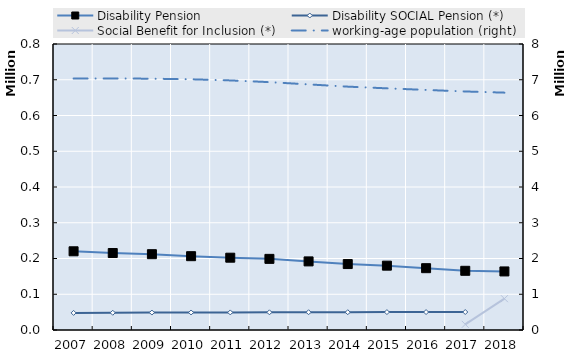
| Category | Disability Pension | Disability SOCIAL Pension (*) | Social Benefit for Inclusion (*) |
|---|---|---|---|
| 2007.0 | 220161 | 47835 | 0 |
| 2008.0 | 215330 | 48206 | 0 |
| 2009.0 | 212079 | 48808 | 0 |
| 2010.0 | 206496 | 48992 | 0 |
| 2011.0 | 202257 | 49127 | 0 |
| 2012.0 | 198970 | 49470 | 0 |
| 2013.0 | 191883 | 49734 | 0 |
| 2014.0 | 184441 | 49775 | 0 |
| 2015.0 | 179941 | 50051 | 0 |
| 2016.0 | 172920 | 50156 | 0 |
| 2017.0 | 165603 | 50278 | 15804 |
| 2018.0 | 163815 | 0 | 87656 |